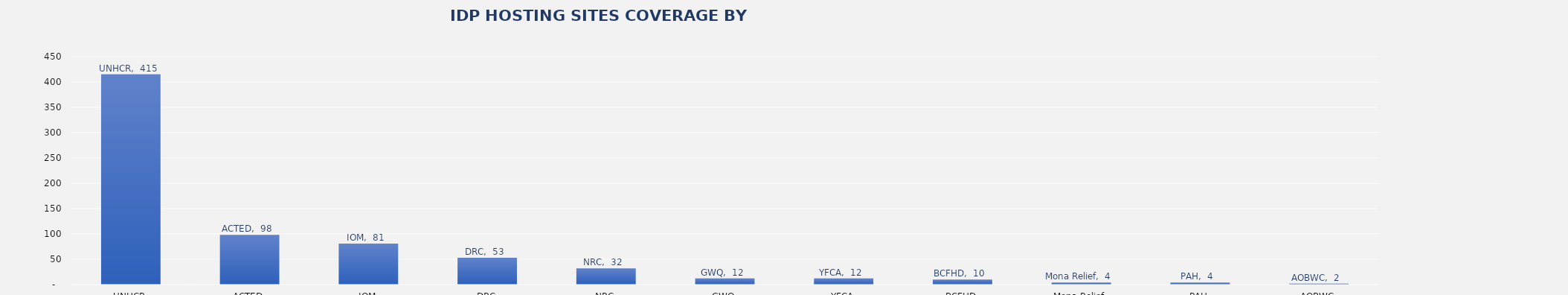
| Category | Total |
|---|---|
| UNHCR | 415 |
| ACTED | 98 |
| IOM | 81 |
| DRC | 53 |
| NRC | 32 |
| GWQ | 12 |
| YFCA | 12 |
| BCFHD | 10 |
| Mona Relief | 4 |
| PAH | 4 |
| AOBWC | 2 |